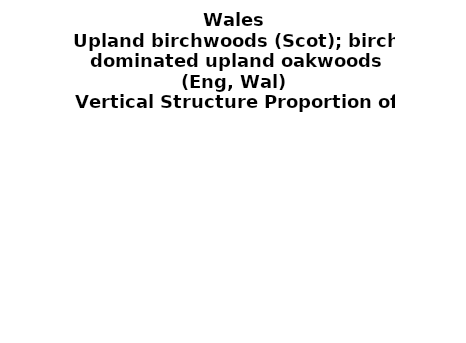
| Category | Upland birchwoods (Scot); birch dominated upland oakwoods (Eng, Wal) |
|---|---|
| No storeys | 0 |
| 1 Storey | 0.169 |
| 2 Storeys | 0.133 |
| 3 Storeys | 0.445 |
| 4 Storeys | 0.095 |
| 5 Storeys | 0 |
| Complex | 0.158 |